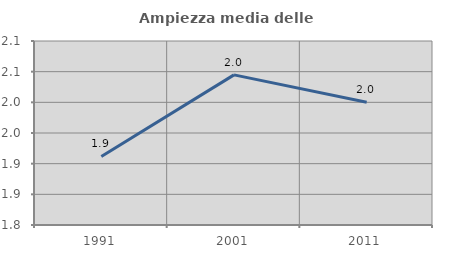
| Category | Ampiezza media delle famiglie |
|---|---|
| 1991.0 | 1.912 |
| 2001.0 | 2.045 |
| 2011.0 | 2 |